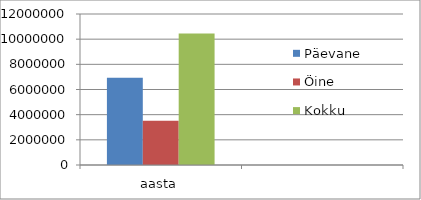
| Category | Päevane | Öine | Kokku |
|---|---|---|---|
| aasta | 6943146.974 | 3507556.613 | 10450703.587 |